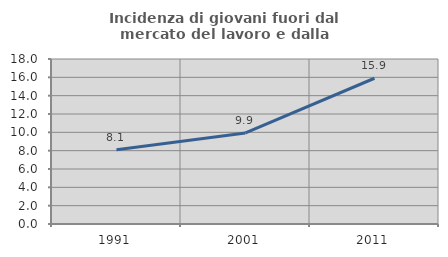
| Category | Incidenza di giovani fuori dal mercato del lavoro e dalla formazione  |
|---|---|
| 1991.0 | 8.105 |
| 2001.0 | 9.935 |
| 2011.0 | 15.9 |